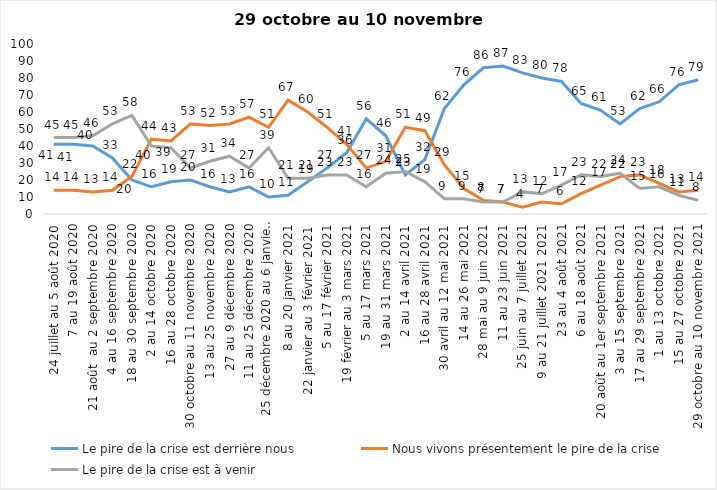
| Category | Le pire de la crise est derrière nous | Nous vivons présentement le pire de la crise | Le pire de la crise est à venir |
|---|---|---|---|
| 24 juillet au 5 août 2020 | 41 | 14 | 45 |
| 7 au 19 août 2020 | 41 | 14 | 45 |
| 21 août  au 2 septembre 2020 | 40 | 13 | 46 |
| 4 au 16 septembre 2020 | 33 | 14 | 53 |
| 18 au 30 septembre 2020 | 20 | 22 | 58 |
| 2 au 14 octobre 2020 | 16 | 44 | 40 |
| 16 au 28 octobre 2020 | 19 | 43 | 39 |
| 30 octobre au 11 novembre 2020 | 20 | 53 | 27 |
| 13 au 25 novembre 2020 | 16 | 52 | 31 |
| 27 au 9 décembre 2020 | 13 | 53 | 34 |
| 11 au 25 décembre 2020 | 16 | 57 | 27 |
| 25 décembre 2020 au 6 janvier 2021 | 10 | 51 | 39 |
| 8 au 20 janvier 2021 | 11 | 67 | 21 |
| 22 janvier au 3 février 2021 | 19 | 60 | 21 |
| 5 au 17 février 2021 | 27 | 51 | 23 |
| 19 février au 3 mars 2021 | 36 | 41 | 23 |
| 5 au 17 mars 2021 | 56 | 27 | 16 |
| 19 au 31 mars 2021 | 46 | 31 | 24 |
| 2 au 14 avril 2021 | 23 | 51 | 25 |
| 16 au 28 avril 2021 | 32 | 49 | 19 |
| 30 avril au 12 mai 2021 | 62 | 29 | 9 |
| 14 au 26 mai 2021 | 76 | 15 | 9 |
| 28 mai au 9 juin 2021 | 86 | 8 | 7 |
| 11 au 23 juin 2021 | 87 | 7 | 7 |
| 25 juin au 7 juillet 2021 | 83 | 4 | 13 |
| 9 au 21 juillet 2021 2021 | 80 | 7 | 12 |
| 23 au 4 août 2021 | 78 | 6 | 17 |
| 6 au 18 août 2021 | 65 | 12 | 23 |
| 20 août au 1er septembre 2021 | 61 | 17 | 22 |
| 3 au 15 septembre 2021 | 53 | 22 | 24 |
| 17 au 29 septembre 2021 | 62 | 23 | 15 |
| 1 au 13 octobre 2021 | 66 | 18 | 16 |
| 15 au 27 octobre 2021 | 76 | 13 | 11 |
| 29 octobre au 10 novembre 2021 | 79 | 14 | 8 |